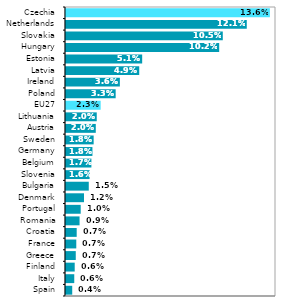
| Category | Series 0 |
|---|---|
| Spain | 0.004 |
| Italy | 0.006 |
| Finland | 0.006 |
| Greece | 0.007 |
| France | 0.007 |
| Croatia | 0.007 |
| Romania | 0.009 |
| Portugal | 0.01 |
| Denmark | 0.012 |
| Bulgaria | 0.015 |
| Slovenia | 0.016 |
| Belgium | 0.017 |
| Germany | 0.018 |
| Sweden | 0.018 |
| Austria | 0.02 |
| Lithuania | 0.02 |
| EU27 | 0.023 |
| Poland | 0.033 |
| Ireland | 0.036 |
| Latvia | 0.049 |
| Estonia | 0.051 |
| Hungary | 0.102 |
| Slovakia | 0.105 |
| Netherlands | 0.121 |
| Czechia | 0.136 |